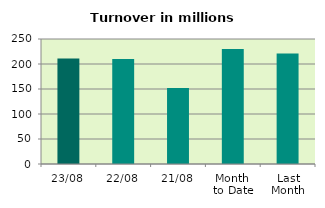
| Category | Series 0 |
|---|---|
| 23/08 | 211.227 |
| 22/08 | 210.063 |
| 21/08 | 152.221 |
| Month 
to Date | 229.972 |
| Last
Month | 220.762 |